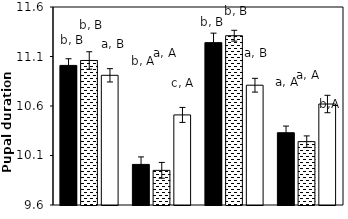
| Category | AB | AC | CK |
|---|---|---|---|
| aCO2-Bt | 11.01 | 11.06 | 10.91 |
| aCO2-Xy | 10.01 | 9.95 | 10.51 |
| eCO2-Bt | 11.24 | 11.31 | 10.81 |
| eCO2-Xy | 10.33 | 10.24 | 10.62 |